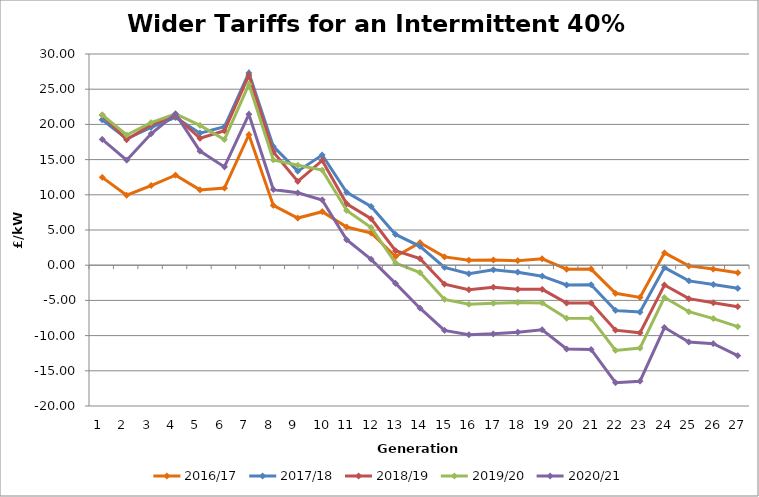
| Category | 2016/17 | 2017/18 | 2018/19 | 2019/20 | 2020/21 |
|---|---|---|---|---|---|
| 1.0 | 12.478 | 20.659 | 21.309 | 21.359 | 17.868 |
| 2.0 | 9.939 | 17.962 | 17.828 | 18.496 | 14.922 |
| 3.0 | 11.318 | 19.58 | 19.971 | 20.252 | 18.66 |
| 4.0 | 12.788 | 20.984 | 21.197 | 21.497 | 21.501 |
| 5.0 | 10.698 | 18.749 | 18.025 | 19.852 | 16.211 |
| 6.0 | 10.95 | 19.658 | 19.096 | 17.856 | 13.965 |
| 7.0 | 18.53 | 27.307 | 26.989 | 25.7 | 21.426 |
| 8.0 | 8.496 | 16.881 | 16.07 | 14.957 | 10.75 |
| 9.0 | 6.698 | 13.357 | 11.908 | 14.194 | 10.279 |
| 10.0 | 7.602 | 15.656 | 14.877 | 13.506 | 9.266 |
| 11.0 | 5.429 | 10.342 | 8.721 | 7.766 | 3.619 |
| 12.0 | 4.574 | 8.339 | 6.599 | 5.354 | 0.83 |
| 13.0 | 1.234 | 4.372 | 2.059 | 0.305 | -2.577 |
| 14.0 | 3.195 | 2.68 | 0.935 | -1.046 | -6.106 |
| 15.0 | 1.178 | -0.307 | -2.695 | -4.863 | -9.266 |
| 16.0 | 0.691 | -1.208 | -3.496 | -5.549 | -9.871 |
| 17.0 | 0.745 | -0.658 | -3.128 | -5.412 | -9.753 |
| 18.0 | 0.638 | -0.995 | -3.424 | -5.293 | -9.507 |
| 19.0 | 0.916 | -1.557 | -3.432 | -5.364 | -9.166 |
| 20.0 | -0.566 | -2.811 | -5.377 | -7.525 | -11.895 |
| 21.0 | -0.554 | -2.787 | -5.371 | -7.553 | -11.969 |
| 22.0 | -3.995 | -6.423 | -9.228 | -12.101 | -16.687 |
| 23.0 | -4.57 | -6.656 | -9.609 | -11.766 | -16.481 |
| 24.0 | 1.751 | -0.348 | -2.811 | -4.584 | -8.858 |
| 25.0 | -0.101 | -2.228 | -4.756 | -6.607 | -10.917 |
| 26.0 | -0.553 | -2.735 | -5.326 | -7.583 | -11.142 |
| 27.0 | -1.074 | -3.282 | -5.893 | -8.733 | -12.85 |